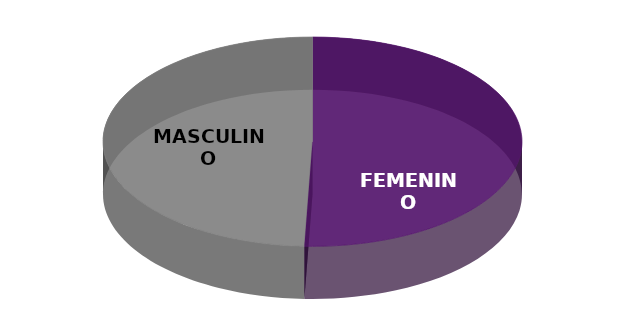
| Category | Series 0 |
|---|---|
| FEMENINO | 123 |
| MASCULINO | 120 |